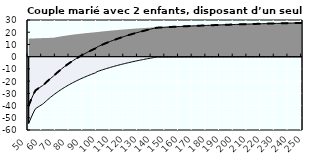
| Category | Coin fiscal moyen (somme des composantes) | Taux moyen d'imposition net en % du salaire brut |
|---|---|---|
| 50.0 | -39.933 | -39.933 |
| 51.0 | -37.189 | -37.189 |
| 52.0 | -34.551 | -34.551 |
| 53.0 | -32.012 | -32.012 |
| 54.0 | -29.568 | -29.568 |
| 55.0 | -27.586 | -27.586 |
| 56.0 | -26.781 | -26.781 |
| 57.0 | -26.004 | -26.004 |
| 58.0 | -25.254 | -25.254 |
| 59.0 | -24.53 | -24.53 |
| 60.0 | -23.829 | -23.829 |
| 61.0 | -22.927 | -22.927 |
| 62.0 | -21.839 | -21.839 |
| 63.0 | -20.786 | -20.786 |
| 64.0 | -19.766 | -19.766 |
| 65.0 | -18.777 | -18.777 |
| 66.0 | -17.819 | -17.819 |
| 67.0 | -16.888 | -16.888 |
| 68.0 | -15.986 | -15.986 |
| 69.0 | -14.928 | -14.928 |
| 70.0 | -13.9 | -13.9 |
| 71.0 | -12.902 | -12.902 |
| 72.0 | -11.931 | -11.931 |
| 73.0 | -10.987 | -10.987 |
| 74.0 | -10.068 | -10.068 |
| 75.0 | -9.174 | -9.174 |
| 76.0 | -8.303 | -8.303 |
| 77.0 | -7.455 | -7.455 |
| 78.0 | -6.629 | -6.629 |
| 79.0 | -5.823 | -5.823 |
| 80.0 | -5.038 | -5.038 |
| 81.0 | -4.272 | -4.272 |
| 82.0 | -3.525 | -3.525 |
| 83.0 | -2.795 | -2.795 |
| 84.0 | -2.084 | -2.084 |
| 85.0 | -1.389 | -1.389 |
| 86.0 | -0.71 | -0.71 |
| 87.0 | -0.046 | -0.046 |
| 88.0 | 0.602 | 0.602 |
| 89.0 | 1.236 | 1.236 |
| 90.0 | 1.855 | 1.855 |
| 91.0 | 2.461 | 2.461 |
| 92.0 | 3.054 | 3.054 |
| 93.0 | 3.634 | 3.634 |
| 94.0 | 4.202 | 4.202 |
| 95.0 | 4.758 | 4.758 |
| 96.0 | 5.302 | 5.302 |
| 97.0 | 5.835 | 5.835 |
| 98.0 | 6.357 | 6.357 |
| 99.0 | 6.868 | 6.868 |
| 100.0 | 7.891 | 7.891 |
| 101.0 | 8.407 | 8.407 |
| 102.0 | 8.912 | 8.912 |
| 103.0 | 9.408 | 9.408 |
| 104.0 | 9.895 | 9.895 |
| 105.0 | 10.372 | 10.372 |
| 106.0 | 10.84 | 10.84 |
| 107.0 | 11.3 | 11.3 |
| 108.0 | 11.751 | 11.751 |
| 109.0 | 12.193 | 12.193 |
| 110.0 | 12.628 | 12.628 |
| 111.0 | 13.055 | 13.055 |
| 112.0 | 13.474 | 13.474 |
| 113.0 | 13.885 | 13.885 |
| 114.0 | 14.29 | 14.29 |
| 115.0 | 14.687 | 14.687 |
| 116.0 | 15.078 | 15.078 |
| 117.0 | 15.462 | 15.462 |
| 118.0 | 15.839 | 15.839 |
| 119.0 | 16.211 | 16.211 |
| 120.0 | 16.575 | 16.575 |
| 121.0 | 16.934 | 16.934 |
| 122.0 | 17.287 | 17.287 |
| 123.0 | 17.635 | 17.635 |
| 124.0 | 17.976 | 17.976 |
| 125.0 | 18.312 | 18.312 |
| 126.0 | 18.643 | 18.643 |
| 127.0 | 18.969 | 18.969 |
| 128.0 | 19.29 | 19.29 |
| 129.0 | 19.605 | 19.605 |
| 130.0 | 19.916 | 19.916 |
| 131.0 | 20.222 | 20.222 |
| 132.0 | 20.523 | 20.523 |
| 133.0 | 20.82 | 20.82 |
| 134.0 | 21.112 | 21.112 |
| 135.0 | 21.4 | 21.4 |
| 136.0 | 21.684 | 21.684 |
| 137.0 | 21.964 | 21.964 |
| 138.0 | 22.24 | 22.24 |
| 139.0 | 22.511 | 22.511 |
| 140.0 | 22.779 | 22.779 |
| 141.0 | 23.043 | 23.043 |
| 142.0 | 23.303 | 23.303 |
| 143.0 | 23.56 | 23.56 |
| 144.0 | 23.723 | 23.723 |
| 145.0 | 23.787 | 23.787 |
| 146.0 | 23.85 | 23.85 |
| 147.0 | 23.912 | 23.912 |
| 148.0 | 23.974 | 23.974 |
| 149.0 | 24.034 | 24.034 |
| 150.0 | 24.094 | 24.094 |
| 151.0 | 24.153 | 24.153 |
| 152.0 | 24.211 | 24.211 |
| 153.0 | 24.268 | 24.268 |
| 154.0 | 24.325 | 24.325 |
| 155.0 | 24.381 | 24.381 |
| 156.0 | 24.436 | 24.436 |
| 157.0 | 24.491 | 24.491 |
| 158.0 | 24.545 | 24.545 |
| 159.0 | 24.598 | 24.598 |
| 160.0 | 24.65 | 24.65 |
| 161.0 | 24.702 | 24.702 |
| 162.0 | 24.754 | 24.754 |
| 163.0 | 24.804 | 24.804 |
| 164.0 | 24.854 | 24.854 |
| 165.0 | 24.904 | 24.904 |
| 166.0 | 24.952 | 24.952 |
| 167.0 | 25 | 25 |
| 168.0 | 25.048 | 25.048 |
| 169.0 | 25.095 | 25.095 |
| 170.0 | 25.142 | 25.142 |
| 171.0 | 25.188 | 25.188 |
| 172.0 | 25.233 | 25.233 |
| 173.0 | 25.278 | 25.278 |
| 174.0 | 25.322 | 25.322 |
| 175.0 | 25.366 | 25.366 |
| 176.0 | 25.41 | 25.41 |
| 177.0 | 25.452 | 25.452 |
| 178.0 | 25.495 | 25.495 |
| 179.0 | 25.537 | 25.537 |
| 180.0 | 25.578 | 25.578 |
| 181.0 | 25.619 | 25.619 |
| 182.0 | 25.66 | 25.66 |
| 183.0 | 25.7 | 25.7 |
| 184.0 | 25.74 | 25.74 |
| 185.0 | 25.779 | 25.779 |
| 186.0 | 25.818 | 25.818 |
| 187.0 | 25.856 | 25.856 |
| 188.0 | 25.894 | 25.894 |
| 189.0 | 25.932 | 25.932 |
| 190.0 | 25.969 | 25.969 |
| 191.0 | 26.006 | 26.006 |
| 192.0 | 26.042 | 26.042 |
| 193.0 | 26.078 | 26.078 |
| 194.0 | 26.114 | 26.114 |
| 195.0 | 26.149 | 26.149 |
| 196.0 | 26.184 | 26.184 |
| 197.0 | 26.219 | 26.219 |
| 198.0 | 26.253 | 26.253 |
| 199.0 | 26.287 | 26.287 |
| 200.0 | 26.32 | 26.32 |
| 201.0 | 26.354 | 26.354 |
| 202.0 | 26.387 | 26.387 |
| 203.0 | 26.419 | 26.419 |
| 204.0 | 26.451 | 26.451 |
| 205.0 | 26.483 | 26.483 |
| 206.0 | 26.515 | 26.515 |
| 207.0 | 26.546 | 26.546 |
| 208.0 | 26.577 | 26.577 |
| 209.0 | 26.608 | 26.608 |
| 210.0 | 26.638 | 26.638 |
| 211.0 | 26.669 | 26.669 |
| 212.0 | 26.698 | 26.698 |
| 213.0 | 26.728 | 26.728 |
| 214.0 | 26.757 | 26.757 |
| 215.0 | 26.786 | 26.786 |
| 216.0 | 26.815 | 26.815 |
| 217.0 | 26.844 | 26.844 |
| 218.0 | 26.872 | 26.872 |
| 219.0 | 26.9 | 26.9 |
| 220.0 | 26.928 | 26.928 |
| 221.0 | 26.955 | 26.955 |
| 222.0 | 26.982 | 26.982 |
| 223.0 | 27.009 | 27.009 |
| 224.0 | 27.036 | 27.036 |
| 225.0 | 27.063 | 27.063 |
| 226.0 | 27.089 | 27.089 |
| 227.0 | 27.115 | 27.115 |
| 228.0 | 27.141 | 27.141 |
| 229.0 | 27.166 | 27.166 |
| 230.0 | 27.192 | 27.192 |
| 231.0 | 27.217 | 27.217 |
| 232.0 | 27.242 | 27.242 |
| 233.0 | 27.266 | 27.266 |
| 234.0 | 27.291 | 27.291 |
| 235.0 | 27.315 | 27.315 |
| 236.0 | 27.339 | 27.339 |
| 237.0 | 27.363 | 27.363 |
| 238.0 | 27.387 | 27.387 |
| 239.0 | 27.41 | 27.41 |
| 240.0 | 27.434 | 27.434 |
| 241.0 | 27.457 | 27.457 |
| 242.0 | 27.48 | 27.48 |
| 243.0 | 27.502 | 27.502 |
| 244.0 | 27.525 | 27.525 |
| 245.0 | 27.547 | 27.547 |
| 246.0 | 27.569 | 27.569 |
| 247.0 | 27.591 | 27.591 |
| 248.0 | 27.613 | 27.613 |
| 249.0 | 27.635 | 27.635 |
| 250.0 | 27.656 | 27.656 |